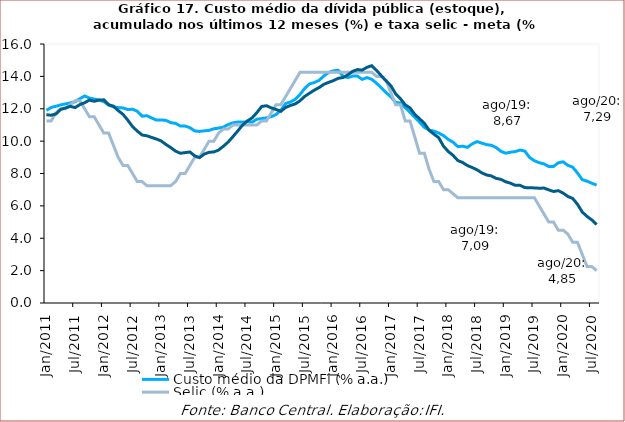
| Category | Custo médio da DPMFi (% a.a.) | Selic (% a.a.) | Custo médio oferta pública DPMFi (% a.a.) |
|---|---|---|---|
| 2011-01-31 | 11.9 | 11.25 | 11.63 |
| 2011-02-28 | 12.08 | 11.25 | 11.6 |
| 2011-03-31 | 12.155 | 11.75 | 11.68 |
| 2011-04-30 | 12.24 | 12 | 11.96 |
| 2011-05-31 | 12.3 | 12 | 12.05 |
| 2011-06-30 | 12.36 | 12.25 | 12.15 |
| 2011-07-31 | 12.43 | 12.5 | 12.07 |
| 2011-08-31 | 12.62 | 12.5 | 12.26 |
| 2011-09-30 | 12.79 | 12 | 12.37 |
| 2011-10-31 | 12.66 | 11.5 | 12.54 |
| 2011-11-30 | 12.6 | 11.5 | 12.46 |
| 2011-12-31 | 12.54 | 11 | 12.54 |
| 2012-01-31 | 12.44 | 10.5 | 12.55 |
| 2012-02-29 | 12.23 | 10.5 | 12.25 |
| 2012-03-31 | 12.12 | 9.75 | 12.16 |
| 2012-04-30 | 12.07 | 9 | 11.89 |
| 2012-05-31 | 12.05 | 8.5 | 11.66 |
| 2012-06-30 | 11.95 | 8.5 | 11.3 |
| 2012-07-31 | 11.97 | 8 | 10.9 |
| 2012-08-31 | 11.85 | 7.5 | 10.62 |
| 2012-09-30 | 11.54 | 7.5 | 10.38 |
| 2012-10-31 | 11.57 | 7.25 | 10.33 |
| 2012-11-30 | 11.43 | 7.25 | 10.23 |
| 2012-12-31 | 11.3 | 7.25 | 10.13 |
| 2013-01-31 | 11.31 | 7.25 | 10.01 |
| 2013-02-28 | 11.28 | 7.25 | 9.79 |
| 2013-03-31 | 11.14 | 7.25 | 9.6 |
| 2013-04-30 | 11.1 | 7.5 | 9.38 |
| 2013-05-31 | 10.93 | 8 | 9.25 |
| 2013-06-30 | 10.93 | 8 | 9.29 |
| 2013-07-31 | 10.83 | 8.5 | 9.33 |
| 2013-08-31 | 10.63 | 9 | 9.09 |
| 2013-09-30 | 10.6 | 9 | 8.98 |
| 2013-10-31 | 10.637 | 9.5 | 9.2 |
| 2013-11-30 | 10.663 | 10 | 9.31 |
| 2013-12-31 | 10.763 | 10 | 9.33 |
| 2014-01-31 | 10.805 | 10.5 | 9.449 |
| 2014-02-28 | 10.867 | 10.75 | 9.686 |
| 2014-03-31 | 11.027 | 10.75 | 9.946 |
| 2014-04-30 | 11.131 | 11 | 10.282 |
| 2014-05-31 | 11.182 | 11 | 10.629 |
| 2014-06-30 | 11.173 | 11 | 10.991 |
| 2014-07-31 | 11.197 | 11 | 11.246 |
| 2014-08-31 | 11.175 | 11 | 11.439 |
| 2014-09-30 | 11.356 | 11 | 11.764 |
| 2014-10-31 | 11.391 | 11.25 | 12.14 |
| 2014-11-30 | 11.435 | 11.25 | 12.187 |
| 2014-12-31 | 11.512 | 11.75 | 12.053 |
| 2015-01-31 | 11.643 | 12.25 | 11.956 |
| 2015-02-27 | 11.909 | 12.25 | 11.84 |
| 2015-03-31 | 12.323 | 12.75 | 12.08 |
| 2015-04-30 | 12.419 | 13.25 | 12.204 |
| 2015-05-31 | 12.579 | 13.75 | 12.297 |
| 2015-06-30 | 12.877 | 14.25 | 12.491 |
| 2015-07-31 | 13.263 | 14.25 | 12.765 |
| 2015-08-31 | 13.532 | 14.25 | 12.96 |
| 2015-09-30 | 13.618 | 14.25 | 13.15 |
| 2015-10-31 | 13.754 | 14.25 | 13.31 |
| 2015-11-30 | 14.029 | 14.25 | 13.51 |
| 2015-12-31 | 14.241 | 14.25 | 13.63 |
| 2016-01-31 | 14.346 | 14.25 | 13.74 |
| 2016-02-29 | 14.372 | 14.25 | 13.88 |
| 2016-03-31 | 14.015 | 14.25 | 13.93 |
| 2016-04-30 | 13.92 | 14.25 | 14.09 |
| 2016-05-31 | 14.016 | 14.25 | 14.31 |
| 2016-06-30 | 14.017 | 14.25 | 14.42 |
| 2016-07-31 | 13.814 | 14.25 | 14.39 |
| 2016-08-31 | 13.924 | 14.25 | 14.56 |
| 2016-09-30 | 13.82 | 14.25 | 14.66 |
| 2016-10-31 | 13.578 | 14 | 14.37 |
| 2016-11-30 | 13.296 | 14 | 14.04 |
| 2016-12-31 | 12.996 | 13.75 | 13.72 |
| 2017-01-31 | 12.739 | 13 | 13.42 |
| 2017-02-28 | 12.394 | 12.25 | 12.92 |
| 2017-03-31 | 12.351 | 12.25 | 12.62 |
| 2017-04-30 | 12.068 | 11.25 | 12.24 |
| 2017-05-31 | 11.784 | 11.25 | 12.05 |
| 2017-06-30 | 11.466 | 10.25 | 11.65 |
| 2017-07-31 | 11.168 | 9.25 | 11.38 |
| 2017-08-31 | 10.85 | 9.25 | 11.1 |
| 2017-09-30 | 10.68 | 8.25 | 10.67 |
| 2017-10-31 | 10.617 | 7.5 | 10.43 |
| 2017-11-30 | 10.498 | 7.5 | 10.21 |
| 2017-12-31 | 10.339 | 7 | 9.69 |
| 2018-01-31 | 10.104 | 7 | 9.36 |
| 2018-02-28 | 9.934 | 6.75 | 9.12 |
| 2018-03-31 | 9.659 | 6.5 | 8.8 |
| 2018-04-30 | 9.686 | 6.5 | 8.68 |
| 2018-05-31 | 9.617 | 6.5 | 8.49 |
| 2018-06-30 | 9.83 | 6.5 | 8.37 |
| 2018-07-31 | 9.971 | 6.5 | 8.23 |
| 2018-08-31 | 9.878 | 6.5 | 8.04 |
| 2018-09-30 | 9.78 | 6.5 | 7.91 |
| 2018-10-31 | 9.743 | 6.5 | 7.85 |
| 2018-11-30 | 9.6 | 6.5 | 7.7 |
| 2018-12-31 | 9.371 | 6.5 | 7.64 |
| 2019-01-31 | 9.254 | 6.5 | 7.49 |
| 2019-02-28 | 9.318 | 6.5 | 7.4 |
| 2019-03-31 | 9.355 | 6.5 | 7.27 |
| 2019-04-30 | 9.449 | 6.5 | 7.27 |
| 2019-05-31 | 9.385 | 6.5 | 7.13 |
| 2019-06-30 | 8.987 | 6.5 | 7.12 |
| 2019-07-31 | 8.788 | 6.5 | 7.11 |
| 2019-08-31 | 8.669 | 6 | 7.09 |
| 2019-09-30 | 8.594 | 5.5 | 7.1 |
| 2019-10-31 | 8.431 | 5 | 6.99 |
| 2019-11-30 | 8.435 | 5 | 6.89 |
| 2019-12-31 | 8.665 | 4.5 | 6.94 |
| 2020-01-31 | 8.723 | 4.5 | 6.79 |
| 2020-02-29 | 8.505 | 4.25 | 6.58 |
| 2020-03-31 | 8.392 | 3.75 | 6.46 |
| 2020-04-30 | 8.031 | 3.75 | 6.1 |
| 2020-05-31 | 7.621 | 3 | 5.62 |
| 2020-06-30 | 7.524 | 2.25 | 5.35 |
| 2020-07-31 | 7.398 | 2.25 | 5.13 |
| 2020-08-31 | 7.286 | 2 | 4.85 |